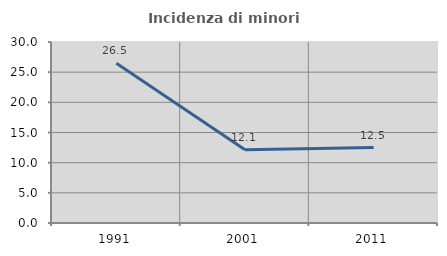
| Category | Incidenza di minori stranieri |
|---|---|
| 1991.0 | 26.471 |
| 2001.0 | 12.121 |
| 2011.0 | 12.5 |